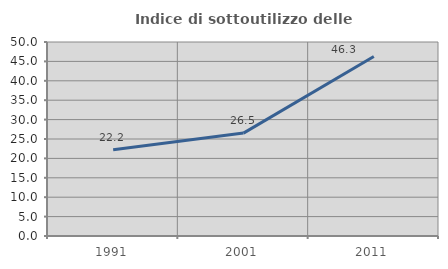
| Category | Indice di sottoutilizzo delle abitazioni  |
|---|---|
| 1991.0 | 22.222 |
| 2001.0 | 26.522 |
| 2011.0 | 46.256 |